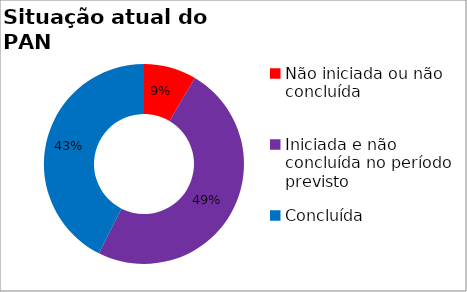
| Category | Series 0 |
|---|---|
| Não iniciada ou não concluída | 0.085 |
| Iniciada e não concluída no período previsto | 0.489 |
| Concluída | 0.426 |